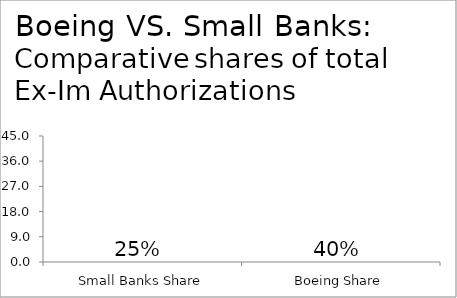
| Category | Series 0 |
|---|---|
| Small Banks Share | 0 |
| Boeing Share | 0 |